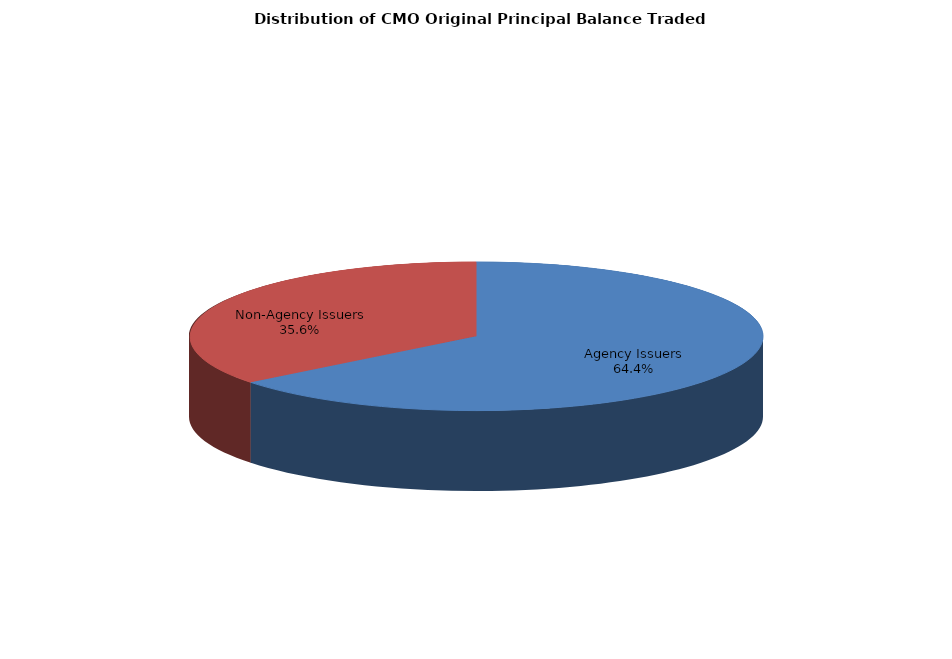
| Category | Series 0 |
|---|---|
| Agency Issuers | 7288074145.885 |
| Non-Agency Issuers | 4036718781.884 |